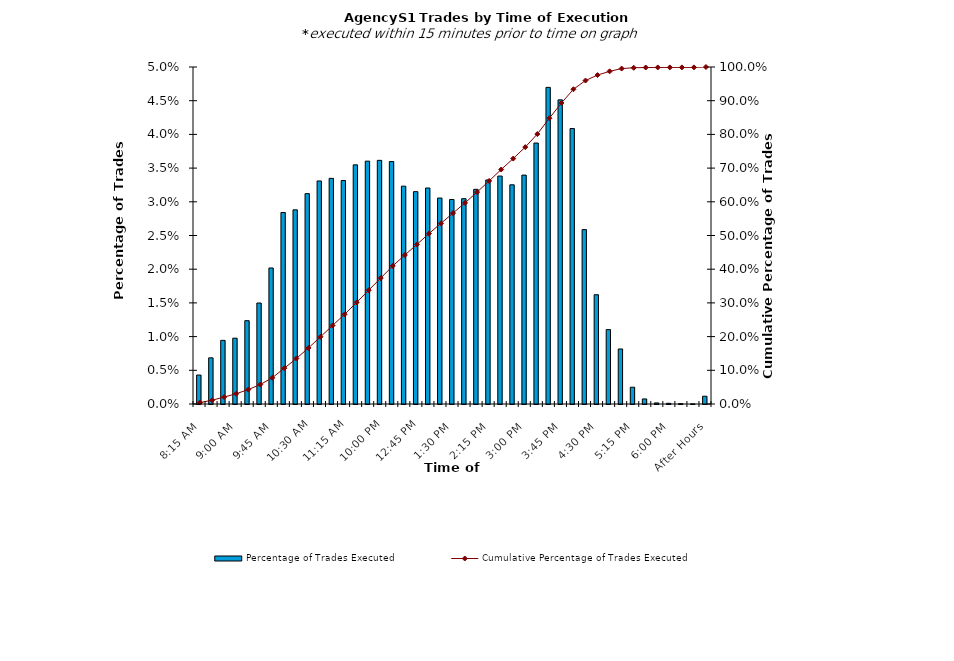
| Category | Percentage of Trades Executed |
|---|---|
| 8:15 AM | 0.004 |
| 8:30 AM | 0.007 |
| 8:45 AM | 0.009 |
| 9:00 AM | 0.01 |
| 9:15 AM | 0.012 |
| 9:30 AM | 0.015 |
| 9:45 AM | 0.02 |
| 10:00 AM | 0.028 |
| 10:15 AM | 0.029 |
| 10:30 AM | 0.031 |
| 10:45 AM | 0.033 |
| 11:00 AM | 0.033 |
| 11:15 AM | 0.033 |
| 11:30 AM | 0.035 |
| 11:45 AM | 0.036 |
| 12:00 PM | 0.036 |
| 12:15 PM | 0.036 |
| 12:30 PM | 0.032 |
| 12:45 PM | 0.032 |
| 1:00 PM | 0.032 |
| 1:15 PM | 0.031 |
| 1:30 PM | 0.03 |
| 1:45 PM | 0.03 |
| 2:00 PM | 0.032 |
| 2:15 PM | 0.033 |
| 2:30 PM | 0.034 |
| 2:45 PM | 0.033 |
| 3:00 PM | 0.034 |
| 3:15 PM | 0.039 |
| 3:30 PM | 0.047 |
| 3:45 PM | 0.045 |
| 4:00 PM | 0.041 |
| 4:15 PM | 0.026 |
| 4:30 PM | 0.016 |
| 4:45 PM | 0.011 |
| 5:00 PM | 0.008 |
| 5:15 PM | 0.002 |
| 5:30 PM | 0.001 |
| 5:45 PM | 0 |
| 6:00 PM | 0 |
| 6:15 PM | 0 |
| 6:30 PM | 0 |
| After Hours | 0.001 |